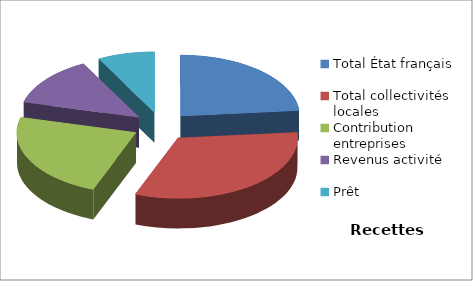
| Category | Series 0 |
|---|---|
| Total État français | 7000 |
| Total collectivités locales | 9600 |
| Contribution entreprises | 6900 |
| Revenus activité | 3927 |
| Prêt | 2300 |